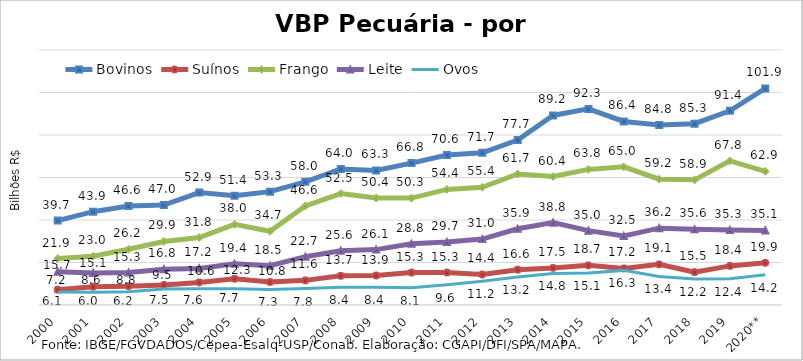
| Category | Bovinos | Suínos | Frango | Leite | Ovos |
|---|---|---|---|---|---|
| 2000 | 39.734 | 7.194 | 21.864 | 15.694 | 6.136 |
| 2001 | 43.922 | 8.631 | 22.98 | 15.102 | 6.047 |
| 2002 | 46.609 | 8.846 | 26.231 | 15.292 | 6.23 |
| 2003 | 47.041 | 9.454 | 29.906 | 16.84 | 7.536 |
| 2004 | 52.927 | 10.63 | 31.756 | 17.212 | 7.638 |
| 2005 | 51.384 | 12.324 | 37.966 | 19.358 | 7.69 |
| 2006 | 53.349 | 10.841 | 34.684 | 18.49 | 7.304 |
| 2007 | 57.978 | 11.592 | 46.601 | 22.731 | 7.763 |
| 2008 | 64.015 | 13.726 | 52.458 | 25.571 | 8.384 |
| 2009 | 63.347 | 13.875 | 50.367 | 26.07 | 8.36 |
| 2010 | 66.787 | 15.264 | 50.306 | 28.791 | 8.13 |
| 2011 | 70.604 | 15.288 | 54.409 | 29.68 | 9.58 |
| 2012 | 71.657 | 14.355 | 55.424 | 31.014 | 11.231 |
| 2013 | 77.651 | 16.621 | 61.688 | 35.89 | 13.209 |
| 2014 | 89.206 | 17.457 | 60.44 | 38.756 | 14.841 |
| 2015 | 92.277 | 18.656 | 63.806 | 34.984 | 15.111 |
| 2016 | 86.375 | 17.217 | 65.014 | 32.461 | 16.29 |
| 2017 | 84.762 | 19.113 | 59.216 | 36.168 | 13.427 |
| 2018 | 85.33 | 15.479 | 58.893 | 35.631 | 12.21 |
| 2019 | 91.37 | 18.398 | 67.81 | 35.296 | 12.361 |
| 2020** | 101.931 | 19.864 | 62.899 | 35.11 | 14.192 |